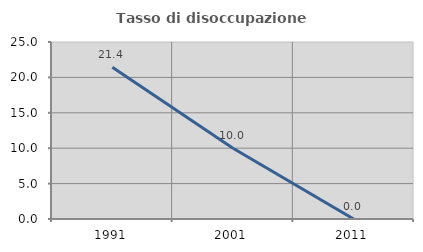
| Category | Tasso di disoccupazione giovanile  |
|---|---|
| 1991.0 | 21.429 |
| 2001.0 | 10 |
| 2011.0 | 0 |